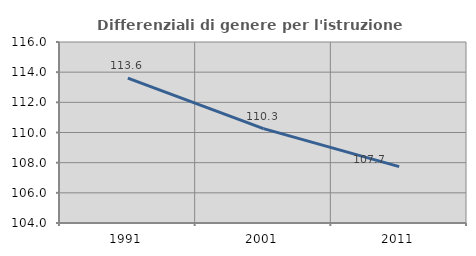
| Category | Differenziali di genere per l'istruzione superiore |
|---|---|
| 1991.0 | 113.604 |
| 2001.0 | 110.258 |
| 2011.0 | 107.74 |